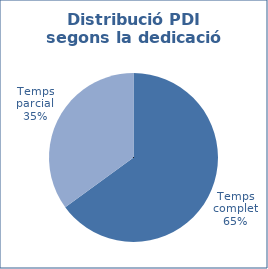
| Category | Series 0 |
|---|---|
| Temps complet | 1658 |
| Temps parcial | 894 |